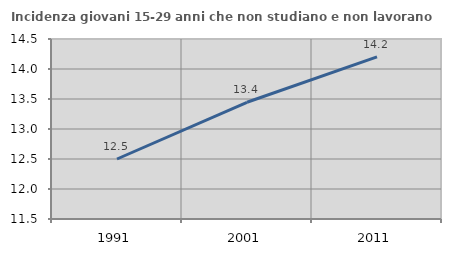
| Category | Incidenza giovani 15-29 anni che non studiano e non lavorano  |
|---|---|
| 1991.0 | 12.5 |
| 2001.0 | 13.445 |
| 2011.0 | 14.201 |